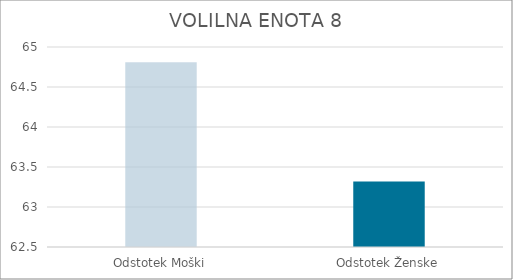
| Category | Series 0 |
|---|---|
| Odstotek Moški | 64.81 |
| Odstotek Ženske | 63.32 |